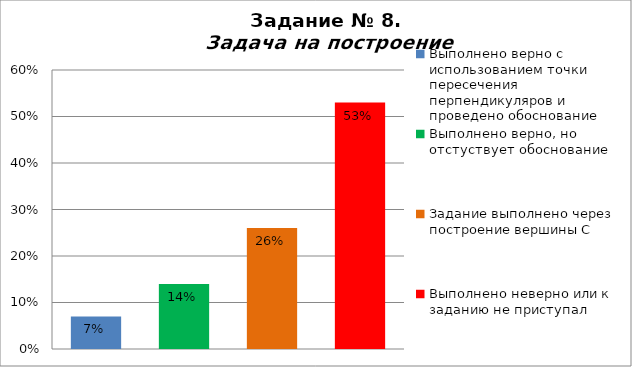
| Category | Задача на построение |
|---|---|
| Выполнено верно с использованием точки пересечения перпендикуляров и проведено обоснование | 0.07 |
| Выполнено верно, но отстуствует обоснование | 0.14 |
| Задание выполнено через построение вершины С | 0.26 |
| Выполнено неверно или к заданию не приступал | 0.53 |